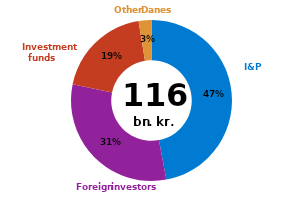
| Category | Sum af Nettotrans |
|---|---|
| I&P incl. underlying investment funds | 54.4 |
| Foreign investors | 36.031 |
| Investment funds | 22.216 |
| Other Danes | 2.978 |